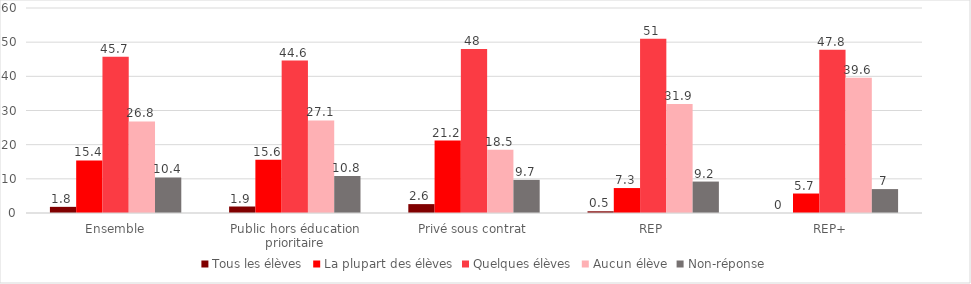
| Category | Tous les élèves | La plupart des élèves | Quelques élèves | Aucun élève | Non-réponse |
|---|---|---|---|---|---|
| Ensemble | 1.8 | 15.4 | 45.7 | 26.8 | 10.4 |
| Public hors éducation prioritaire | 1.9 | 15.6 | 44.6 | 27.1 | 10.8 |
| Privé sous contrat | 2.6 | 21.2 | 48 | 18.5 | 9.7 |
| REP | 0.5 | 7.3 | 51 | 31.9 | 9.2 |
| REP+ | 0 | 5.7 | 47.8 | 39.6 | 7 |